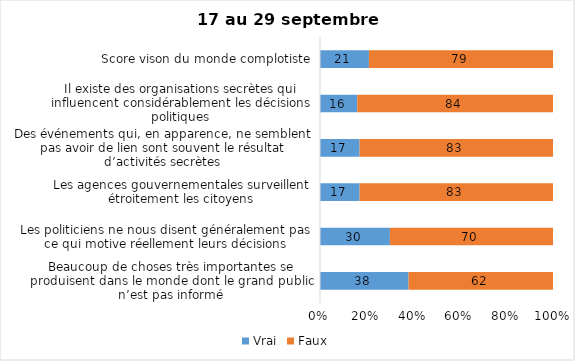
| Category | Vrai | Faux |
|---|---|---|
| Beaucoup de choses très importantes se produisent dans le monde dont le grand public n’est pas informé | 38 | 62 |
| Les politiciens ne nous disent généralement pas ce qui motive réellement leurs décisions | 30 | 70 |
| Les agences gouvernementales surveillent étroitement les citoyens | 17 | 83 |
| Des événements qui, en apparence, ne semblent pas avoir de lien sont souvent le résultat d’activités secrètes | 17 | 83 |
| Il existe des organisations secrètes qui influencent considérablement les décisions politiques | 16 | 84 |
| Score vison du monde complotiste | 21 | 79 |